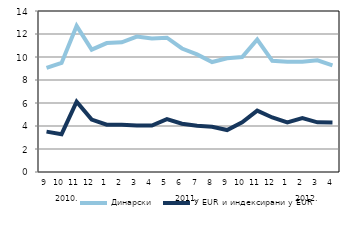
| Category | Динарски | У EUR и индексирани у EUR |
|---|---|---|
| 0 | 9.05 | 3.51 |
| 1900-01-01 | 9.48 | 3.29 |
| 1900-01-02 | 12.7 | 6.12 |
| 1900-01-03 | 10.64 | 4.56 |
| 1900-01-04 | 11.21 | 4.11 |
| 1900-01-05 | 11.28 | 4.1 |
| 1900-01-06 | 11.78 | 4.04 |
| 1900-01-07 | 11.6 | 4.04 |
| 1900-01-08 | 11.68 | 4.6 |
| 1900-01-09 | 10.74 | 4.2 |
| 1900-01-10 | 10.23 | 4.02 |
| 1900-01-11 | 9.56 | 3.94 |
| 1900-01-12 | 9.89 | 3.65 |
| 1900-01-13 | 9.99 | 4.32 |
| 1900-01-14 | 11.52 | 5.34 |
| 1900-01-15 | 9.67 | 4.74 |
| 1900-01-16 | 9.59 | 4.32 |
| 1900-01-17 | 9.59 | 4.69 |
| 1900-01-18 | 9.71 | 4.32 |
| 1900-01-19 | 9.27 | 4.3 |